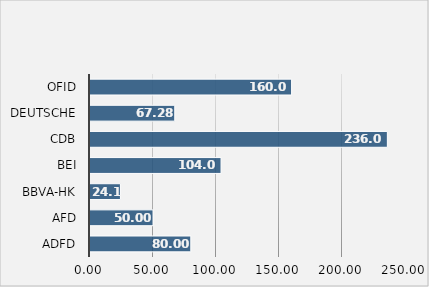
| Category | Series 0 |
|---|---|
| ADFD | 80 |
| AFD | 50 |
| BBVA-HK | 24.146 |
| BEI | 104 |
| CDB | 236 |
| Deutsche | 67.276 |
| OFID | 160 |